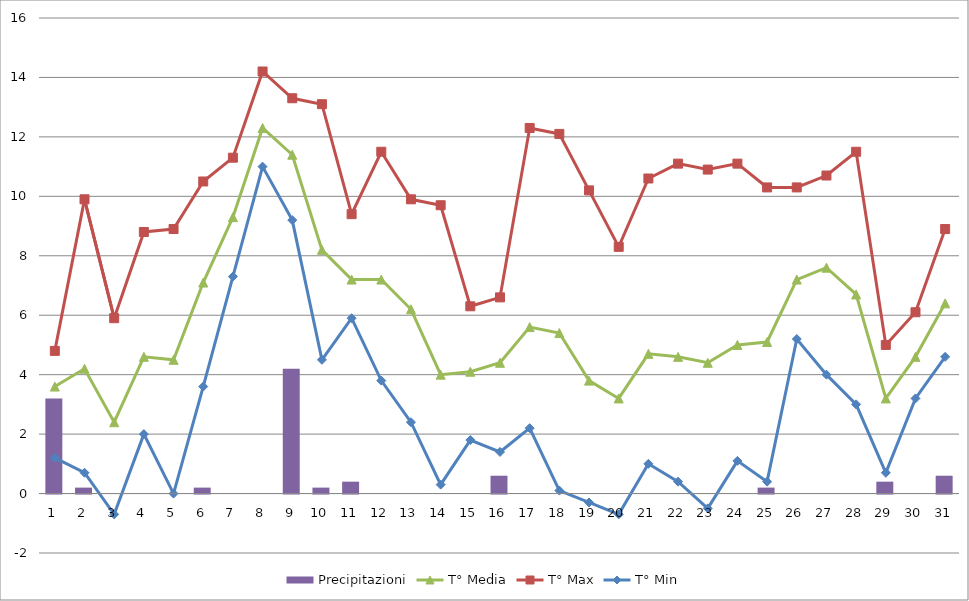
| Category | Precipitazioni |
|---|---|
| 0 | 3.2 |
| 1 | 0.2 |
| 2 | 0 |
| 3 | 0 |
| 4 | 0 |
| 5 | 0.2 |
| 6 | 0 |
| 7 | 0 |
| 8 | 4.2 |
| 9 | 0.2 |
| 10 | 0.4 |
| 11 | 0 |
| 12 | 0 |
| 13 | 0 |
| 14 | 0 |
| 15 | 0.6 |
| 16 | 0 |
| 17 | 0 |
| 18 | 0 |
| 19 | 0 |
| 20 | 0 |
| 21 | 0 |
| 22 | 0 |
| 23 | 0 |
| 24 | 0.2 |
| 25 | 0 |
| 26 | 0 |
| 27 | 0 |
| 28 | 0.4 |
| 29 | 0 |
| 30 | 0.6 |